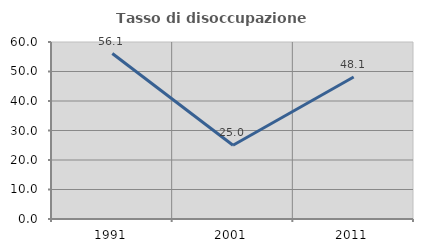
| Category | Tasso di disoccupazione giovanile  |
|---|---|
| 1991.0 | 56.098 |
| 2001.0 | 25 |
| 2011.0 | 48.148 |